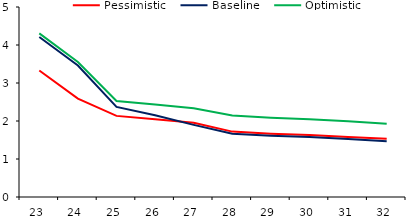
| Category | Pessimistic | Baseline | Optimistic |
|---|---|---|---|
| 23.0 | 3.329 | 4.212 | 4.305 |
| 24.0 | 2.59 | 3.459 | 3.551 |
| 25.0 | 2.135 | 2.372 | 2.524 |
| 26.0 | 2.049 | 2.153 | 2.436 |
| 27.0 | 1.954 | 1.898 | 2.338 |
| 28.0 | 1.721 | 1.666 | 2.145 |
| 29.0 | 1.667 | 1.613 | 2.088 |
| 30.0 | 1.63 | 1.577 | 2.048 |
| 31.0 | 1.582 | 1.525 | 1.992 |
| 32.0 | 1.53 | 1.467 | 1.93 |